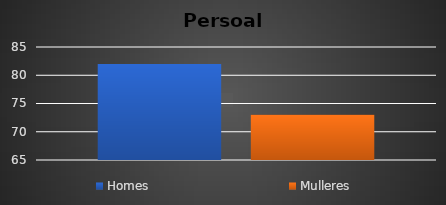
| Category | Homes | Mulleres |
|---|---|---|
| 0 | 82 | 73 |